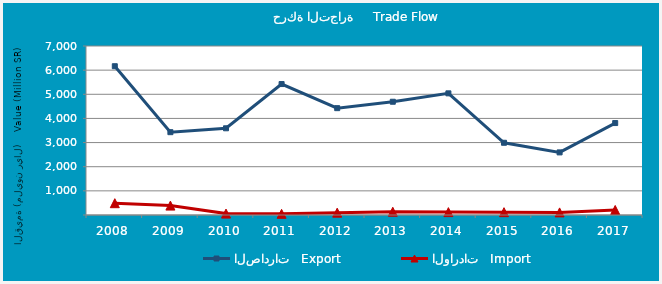
| Category | الصادرات   Export | الواردات   Import |
|---|---|---|
| 2008.0 | 6162605323 | 489214292 |
| 2009.0 | 3430251868 | 390136422 |
| 2010.0 | 3591405356 | 58270163 |
| 2011.0 | 5424060210 | 48634845 |
| 2012.0 | 4425067386 | 96600568 |
| 2013.0 | 4691130544 | 135547500 |
| 2014.0 | 5038435503 | 119705124 |
| 2015.0 | 2991788374 | 117659780 |
| 2016.0 | 2593057062 | 107881757 |
| 2017.0 | 3808456029 | 208276725 |